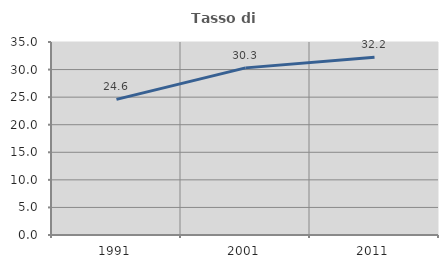
| Category | Tasso di occupazione   |
|---|---|
| 1991.0 | 24.6 |
| 2001.0 | 30.308 |
| 2011.0 | 32.222 |